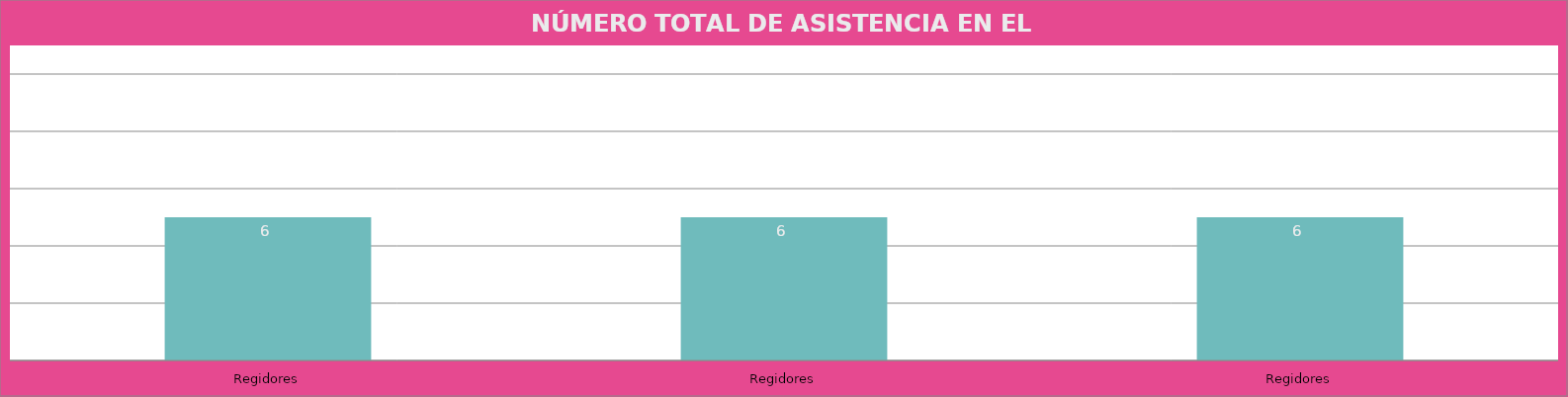
| Category | Regidores |
|---|---|
| Regidores | 6 |
| Regidores | 6 |
| Regidores | 6 |